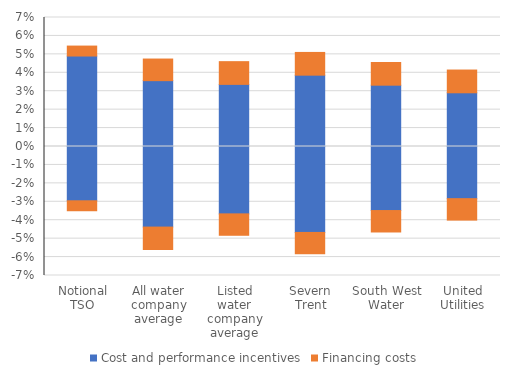
| Category | Cost and performance incentives | Financing costs |
|---|---|---|
| Notional TSO | 0.049 | 0.005 |
| All water company average | 0.036 | 0.012 |
| Listed water company average | 0.034 | 0.012 |
| Severn Trent | 0.039 | 0.012 |
| South West Water | 0.033 | 0.012 |
| United Utilities | 0.029 | 0.012 |